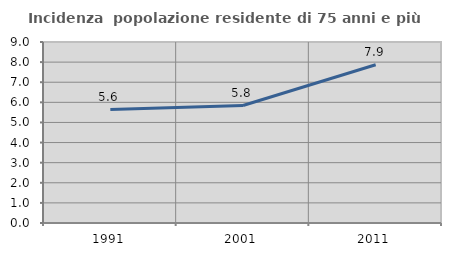
| Category | Incidenza  popolazione residente di 75 anni e più |
|---|---|
| 1991.0 | 5.638 |
| 2001.0 | 5.842 |
| 2011.0 | 7.871 |